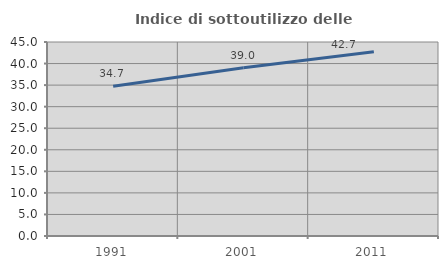
| Category | Indice di sottoutilizzo delle abitazioni  |
|---|---|
| 1991.0 | 34.737 |
| 2001.0 | 39.048 |
| 2011.0 | 42.718 |